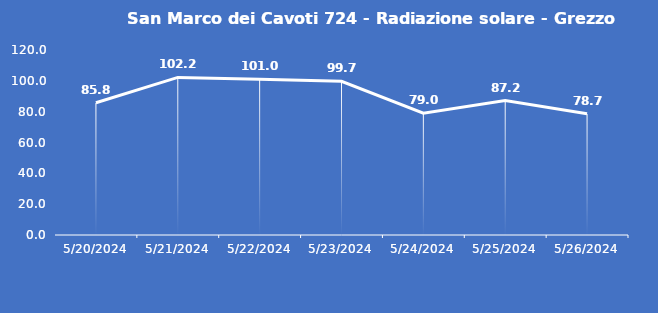
| Category | San Marco dei Cavoti 724 - Radiazione solare - Grezzo (W/m2) |
|---|---|
| 5/20/24 | 85.8 |
| 5/21/24 | 102.2 |
| 5/22/24 | 101 |
| 5/23/24 | 99.7 |
| 5/24/24 | 79 |
| 5/25/24 | 87.2 |
| 5/26/24 | 78.7 |